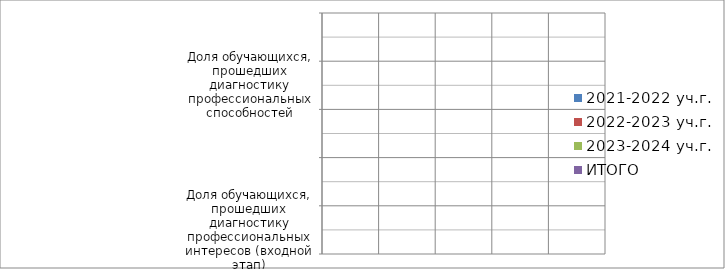
| Category | 2021-2022 уч.г. | 2022-2023 уч.г. | 2023-2024 уч.г. | ИТОГО |
|---|---|---|---|---|
| Доля обучающихся, прошедших диагностику профессиональных интересов (входной этап) | 0 | 0 | 0 | 0 |
| Доля обучающихся, прошедших диагностику профессиональных интересов (промежуточный этап) | 0 | 0 | 0 | 0 |
| Доля обучающихся, прошедших диагностику профессиональных интересов (итоговый этап) | 0 | 0 | 0 | 0 |
| Доля обучающихся, прошедших диагностику профессиональных способностей | 0 | 0 | 0 | 0 |
| Доля педагогических работников, принявших участие в исследовании профессиональных деффициатов в области развития у обучающихся навыков их профессионального самоопределения | 0 | 0 | 0 | 0 |